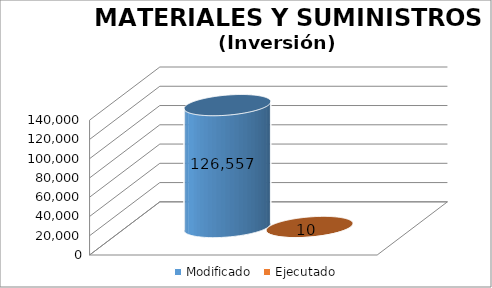
| Category | Modificado | Ejecutado |
|---|---|---|
| 0 | 126557 | 10 |